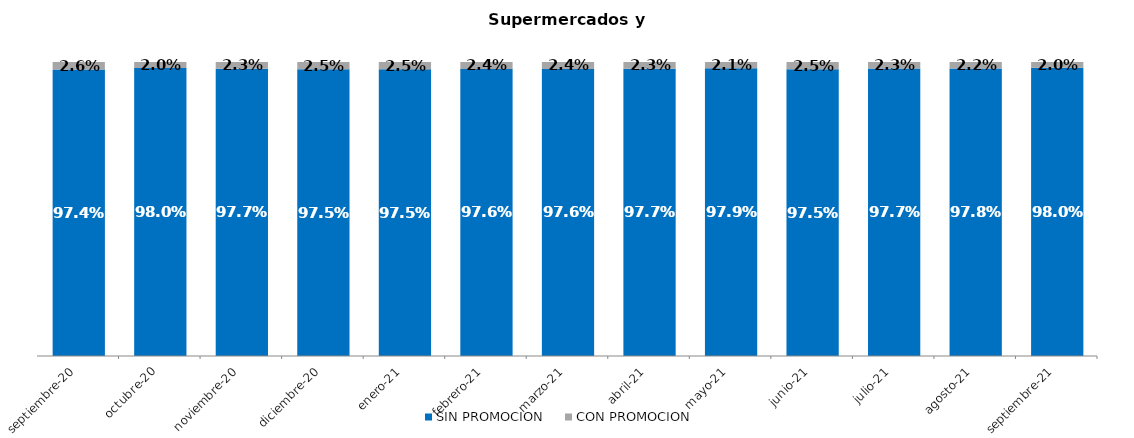
| Category | SIN PROMOCION   | CON PROMOCION   |
|---|---|---|
| 2020-09-01 | 0.974 | 0.026 |
| 2020-10-01 | 0.98 | 0.02 |
| 2020-11-01 | 0.977 | 0.023 |
| 2020-12-01 | 0.975 | 0.025 |
| 2021-01-01 | 0.975 | 0.025 |
| 2021-02-01 | 0.976 | 0.024 |
| 2021-03-01 | 0.976 | 0.024 |
| 2021-04-01 | 0.977 | 0.023 |
| 2021-05-01 | 0.979 | 0.021 |
| 2021-06-01 | 0.975 | 0.025 |
| 2021-07-01 | 0.977 | 0.023 |
| 2021-08-01 | 0.978 | 0.022 |
| 2021-09-01 | 0.98 | 0.02 |